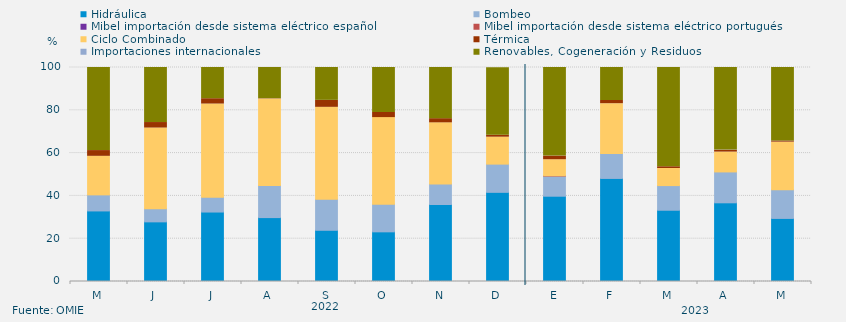
| Category | Hidráulica | Bombeo | Mibel importación desde sistema eléctrico español | Mibel importación desde sistema eléctrico portugués | Ciclo Combinado | Térmica | Importaciones internacionales | Renovables, Cogeneración y Residuos |
|---|---|---|---|---|---|---|---|---|
| M | 32.975 | 7.504 | 0 | 0 | 18.011 | 2.688 | 0 | 38.822 |
| J | 27.87 | 6.134 | 0 | 0 | 37.708 | 2.569 | 0 | 25.718 |
| J | 32.46 | 6.855 | 0 | 0 | 43.616 | 2.487 | 0 | 14.583 |
| A | 29.861 | 14.964 | 0 | 0 | 40.479 | 0.134 | 0 | 14.561 |
| S | 23.935 | 14.514 | 0 | 0 | 42.94 | 3.264 | 0 | 15.347 |
| O | 23.208 | 12.926 | 0 | 0 | 40.457 | 2.419 | 0 | 20.99 |
| N | 35.972 | 9.537 | 0 | 0 | 28.634 | 1.944 | 0 | 23.912 |
| D | 41.662 | 13.19 | 0 | 0 | 12.59 | 0.914 | 0 | 31.537 |
| E | 39.852 | 9.42 | 0 | 0.134 | 7.493 | 1.703 | 0 | 41.398 |
| F | 48.165 | 11.657 | 0 | 0 | 23.264 | 1.488 | 0 | 15.427 |
| M | 33.3 | 11.519 | 0 | 0 | 7.974 | 0.83 | 0 | 46.377 |
| A | 36.771 | 14.433 | 0 | 0 | 9.271 | 0.88 | 0.069 | 38.576 |
| M | 29.48 | 13.418 | 0 | 0 | 22.222 | 0.538 | 0 | 34.341 |